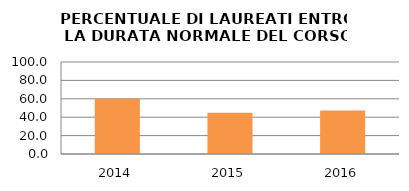
| Category | 2014 2015 2016 |
|---|---|
| 2014.0 | 60 |
| 2015.0 | 44.828 |
| 2016.0 | 47.368 |